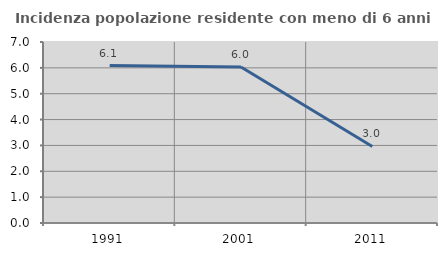
| Category | Incidenza popolazione residente con meno di 6 anni |
|---|---|
| 1991.0 | 6.089 |
| 2001.0 | 6.034 |
| 2011.0 | 2.96 |